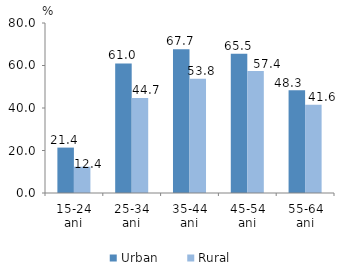
| Category | Urban | Rural |
|---|---|---|
| 15-24 ani | 21.365 | 12.37 |
| 25-34 ani | 60.967 | 44.685 |
| 35-44 ani | 67.662 | 53.794 |
| 45-54 ani | 65.52 | 57.449 |
| 55-64 ani | 48.302 | 41.559 |